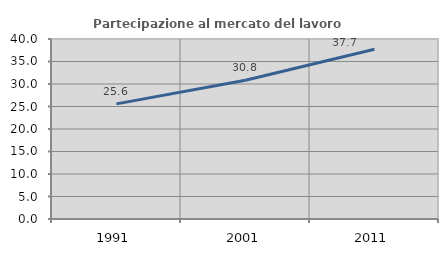
| Category | Partecipazione al mercato del lavoro  femminile |
|---|---|
| 1991.0 | 25.581 |
| 2001.0 | 30.83 |
| 2011.0 | 37.736 |